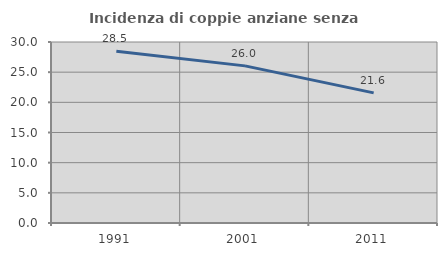
| Category | Incidenza di coppie anziane senza figli  |
|---|---|
| 1991.0 | 28.467 |
| 2001.0 | 26.042 |
| 2011.0 | 21.569 |